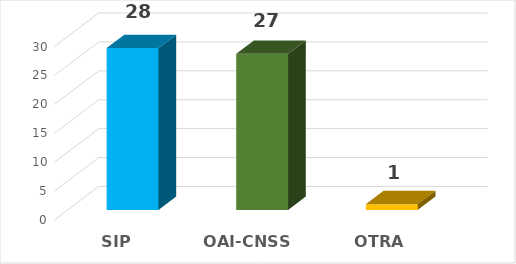
| Category | Series 0 |
|---|---|
| SIP | 28 |
| OAI-CNSS | 27 |
| OTRA ENTIDAD | 1 |